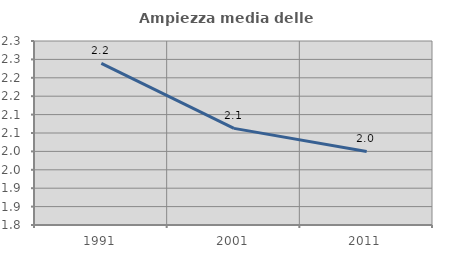
| Category | Ampiezza media delle famiglie |
|---|---|
| 1991.0 | 2.239 |
| 2001.0 | 2.063 |
| 2011.0 | 2 |